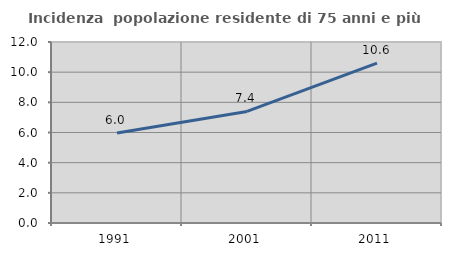
| Category | Incidenza  popolazione residente di 75 anni e più |
|---|---|
| 1991.0 | 5.967 |
| 2001.0 | 7.395 |
| 2011.0 | 10.605 |